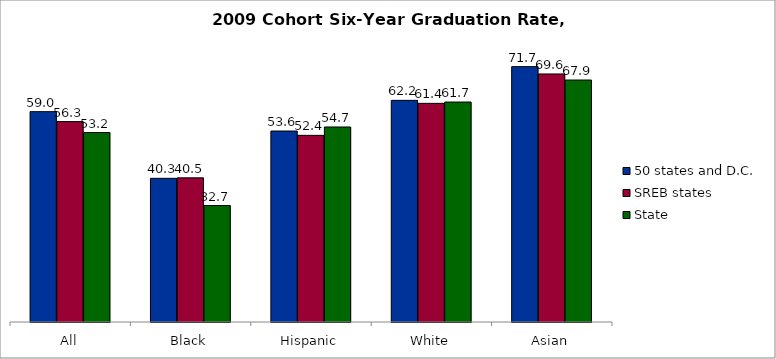
| Category | 50 states and D.C. | SREB states | State |
|---|---|---|---|
| All | 59.044 | 56.262 | 53.178 |
| Black | 40.325 | 40.461 | 32.687 |
| Hispanic | 53.606 | 52.394 | 54.741 |
| White | 62.218 | 61.377 | 61.742 |
| Asian | 71.684 | 69.623 | 67.925 |